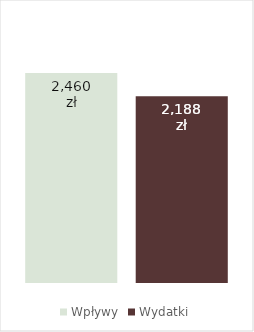
| Category | Wpływy | Wydatki |
|---|---|---|
| 0 | 2460 | 2188.333 |